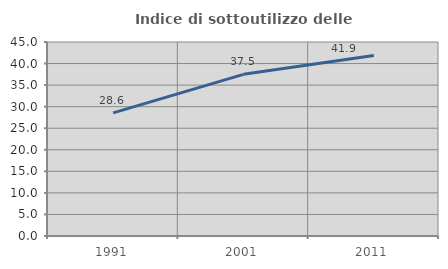
| Category | Indice di sottoutilizzo delle abitazioni  |
|---|---|
| 1991.0 | 28.571 |
| 2001.0 | 37.5 |
| 2011.0 | 41.878 |